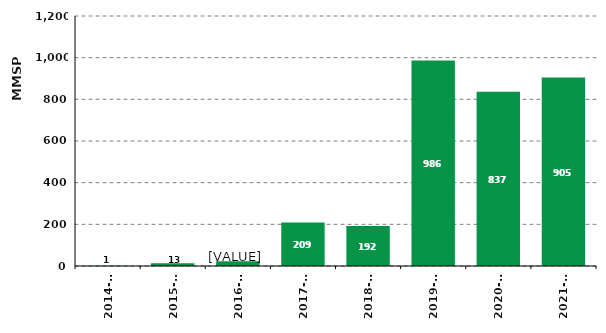
| Category | MMSP Registrations |
|---|---|
| 2014-15 | 1 |
| 2015-16 | 13 |
| 2016-17 | 23 |
| 2017-18 | 209 |
| 2018-19 | 192 |
| 2019-20 | 986 |
| 2020-21 | 837 |
| 2021-22 | 905 |